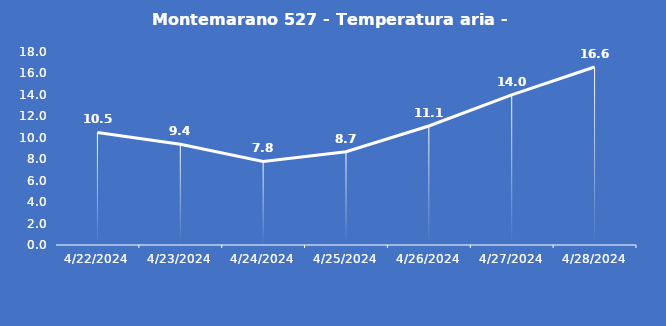
| Category | Montemarano 527 - Temperatura aria - Grezzo (°C) |
|---|---|
| 4/22/24 | 10.5 |
| 4/23/24 | 9.4 |
| 4/24/24 | 7.8 |
| 4/25/24 | 8.7 |
| 4/26/24 | 11.1 |
| 4/27/24 | 14 |
| 4/28/24 | 16.6 |